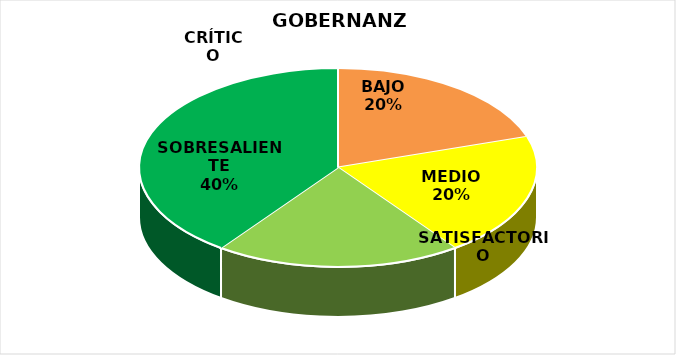
| Category | Series 1 | Series 0 |
|---|---|---|
| CRÍTICO | 0 | 4 |
| BAJO | 1 | 2 |
| MEDIO | 1 | 0 |
| SATISFACTORIO | 1 | 1 |
| SOBRESALIENTE | 2 | 6 |